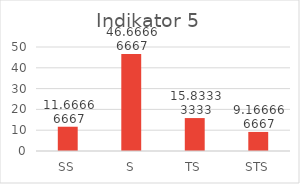
| Category | Series 0 |
|---|---|
| 0 | 11.667 |
| 1 | 46.667 |
| 2 | 15.833 |
| 3 | 9.167 |